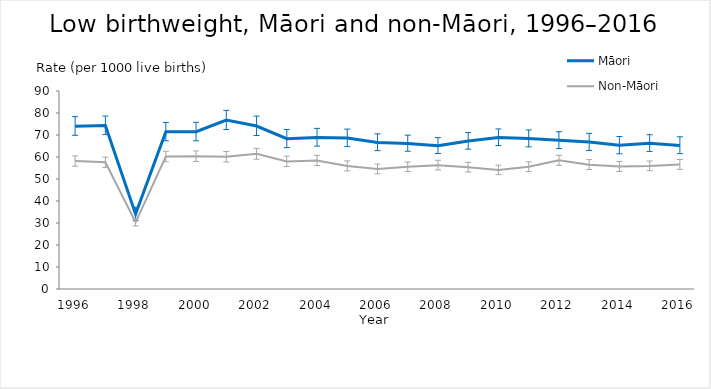
| Category | Māori | Non-Māori |
|---|---|---|
| 1996.0 | 74.012 | 58.132 |
| 1997.0 | 74.315 | 57.574 |
| 1998.0 | 34.033 | 30.321 |
| 1999.0 | 71.442 | 60.178 |
| 2000.0 | 71.469 | 60.301 |
| 2001.0 | 76.753 | 60.092 |
| 2002.0 | 74.069 | 61.424 |
| 2003.0 | 68.295 | 57.979 |
| 2004.0 | 68.886 | 58.384 |
| 2005.0 | 68.631 | 55.916 |
| 2006.0 | 66.629 | 54.56 |
| 2007.0 | 66.191 | 55.523 |
| 2008.0 | 65.135 | 56.298 |
| 2009.0 | 67.244 | 55.339 |
| 2010.0 | 68.914 | 54.098 |
| 2011.0 | 68.371 | 55.551 |
| 2012.0 | 67.584 | 58.475 |
| 2013.0 | 66.768 | 56.519 |
| 2014.0 | 65.295 | 55.662 |
| 2015.0 | 66.25 | 55.953 |
| 2016.0 | 65.266 | 56.603 |